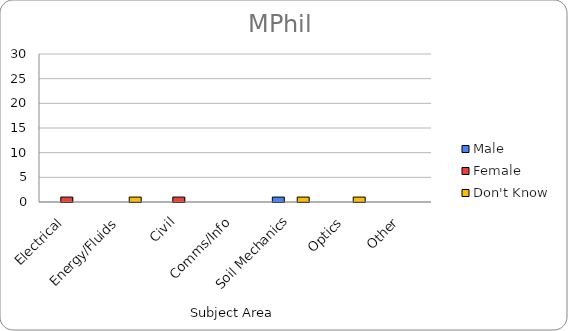
| Category | Male | Female | Don't Know |
|---|---|---|---|
| Electrical | 0 | 1 | 0 |
| Energy/Fluids | 0 | 0 | 1 |
| Civil | 0 | 1 | 0 |
| Comms/Info | 0 | 0 | 0 |
| Soil Mechanics | 1 | 0 | 1 |
| Optics | 0 | 0 | 1 |
| Other | 0 | 0 | 0 |